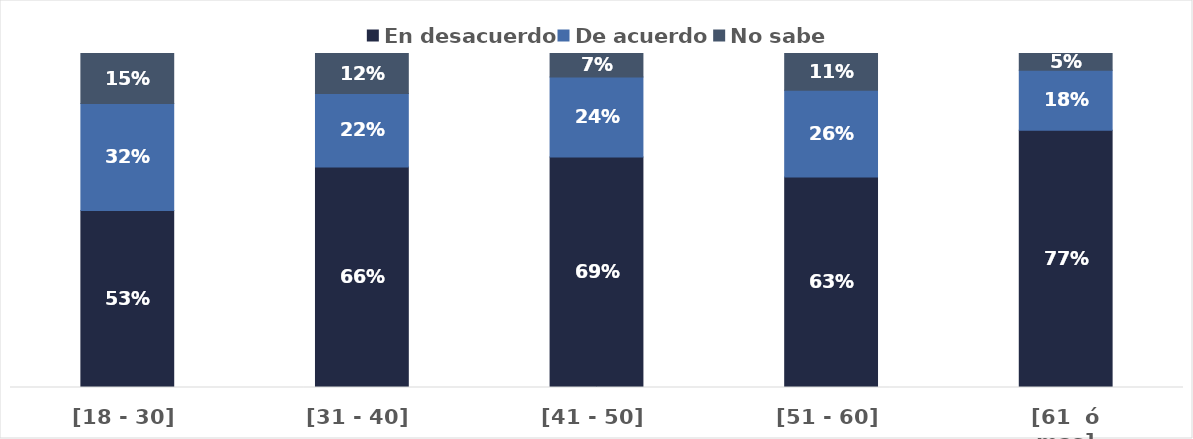
| Category | En desacuerdo | De acuerdo | No sabe |
|---|---|---|---|
| [18 - 30] | 0.53 | 0.32 | 0.15 |
| [31 - 40] | 0.66 | 0.22 | 0.12 |
| [41 - 50] | 0.69 | 0.24 | 0.07 |
| [51 - 60] | 0.63 | 0.26 | 0.11 |
| [61  ó mas] | 0.77 | 0.18 | 0.05 |